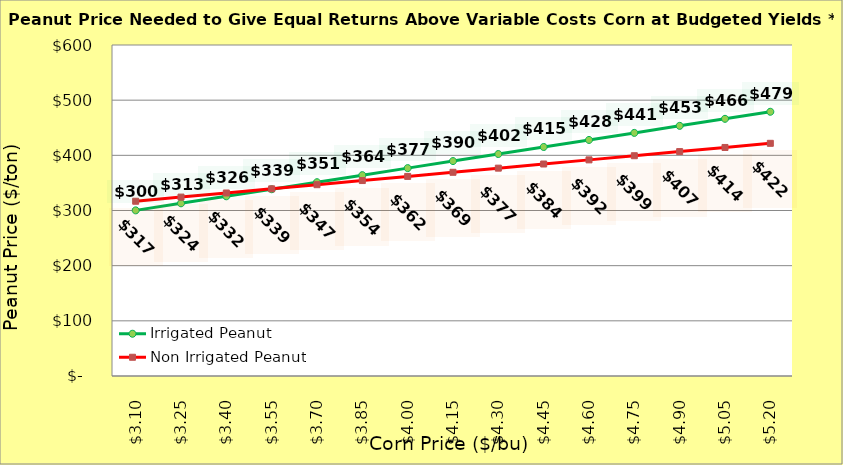
| Category | Irrigated Peanut | Non Irrigated Peanut |
|---|---|---|
| 3.1000000000000005 | 300.242 | 316.775 |
| 3.2500000000000004 | 313.008 | 324.275 |
| 3.4000000000000004 | 325.774 | 331.775 |
| 3.5500000000000003 | 338.54 | 339.275 |
| 3.7 | 351.306 | 346.775 |
| 3.85 | 364.071 | 354.275 |
| 4.0 | 376.837 | 361.775 |
| 4.15 | 389.603 | 369.275 |
| 4.300000000000001 | 402.369 | 376.775 |
| 4.450000000000001 | 415.135 | 384.275 |
| 4.600000000000001 | 427.901 | 391.775 |
| 4.750000000000002 | 440.667 | 399.275 |
| 4.900000000000002 | 453.433 | 406.775 |
| 5.0500000000000025 | 466.199 | 414.275 |
| 5.200000000000003 | 478.965 | 421.775 |